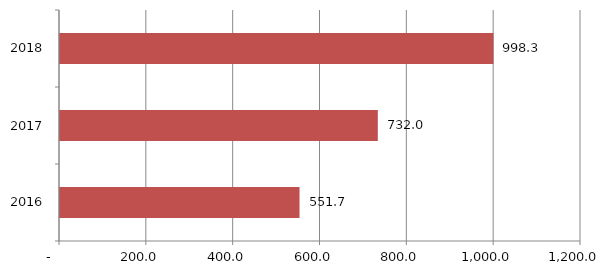
| Category | Series 0 |
|---|---|
| 2016.0 | 551.7 |
| 2017.0 | 732.017 |
| 2018.0 | 998.3 |